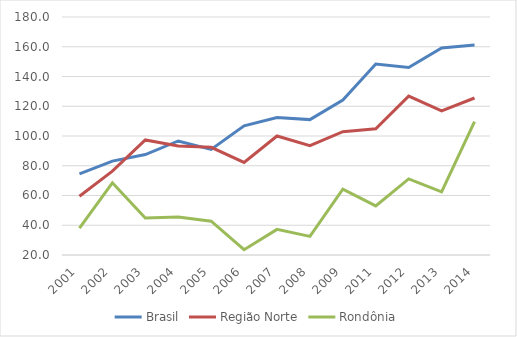
| Category | Brasil | Região Norte | Rondônia |
|---|---|---|---|
| 2001.0 | 74.53 | 59.521 | 38.144 |
| 2002.0 | 83.092 | 76.341 | 68.563 |
| 2003.0 | 87.545 | 97.373 | 44.819 |
| 2004.0 | 96.651 | 93.349 | 45.542 |
| 2005.0 | 90.93 | 92.425 | 42.711 |
| 2006.0 | 106.812 | 82.229 | 23.57 |
| 2007.0 | 112.466 | 100.028 | 37.232 |
| 2008.0 | 111.013 | 93.466 | 32.496 |
| 2009.0 | 124.225 | 102.915 | 64.22 |
| 2011.0 | 148.383 | 104.804 | 52.968 |
| 2012.0 | 146.057 | 126.788 | 71.176 |
| 2013.0 | 159.169 | 116.842 | 62.455 |
| 2014.0 | 161.157 | 125.537 | 109.633 |